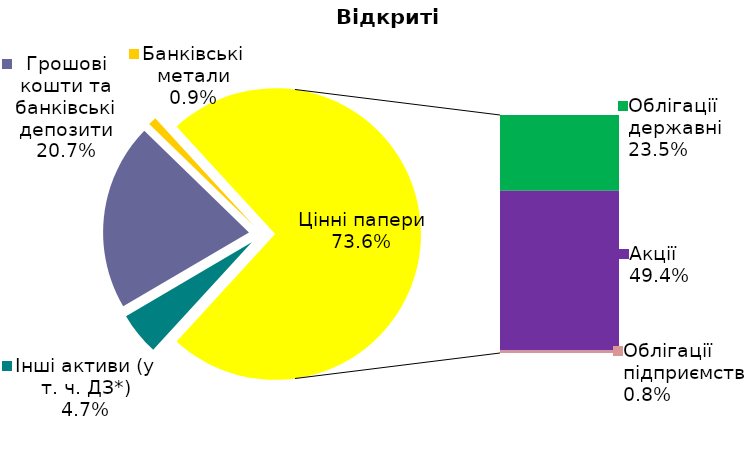
| Category | Series 0 |
|---|---|
| Інші активи (у т. ч. ДЗ*) | 0.047 |
| Грошові кошти та банківські депозити | 0.207 |
| Банківські метали | 0.009 |
| Облігації державні  | 0.235 |
| Акції | 0.494 |
| Облігації підприємств | 0.008 |